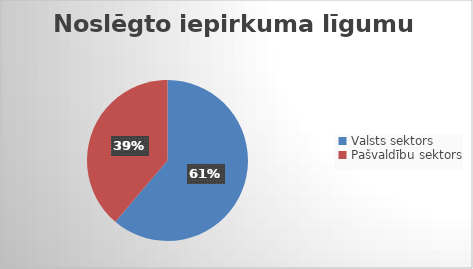
| Category | Noslēgto iepirkuma līgumu skaits |
|---|---|
| Valsts sektors | 412 |
| Pašvaldību sektors | 261 |